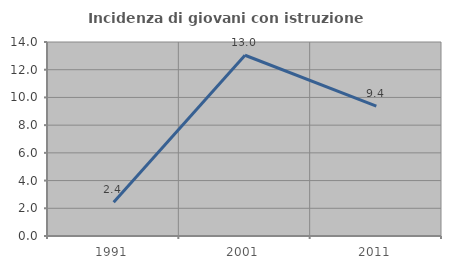
| Category | Incidenza di giovani con istruzione universitaria |
|---|---|
| 1991.0 | 2.439 |
| 2001.0 | 13.043 |
| 2011.0 | 9.375 |